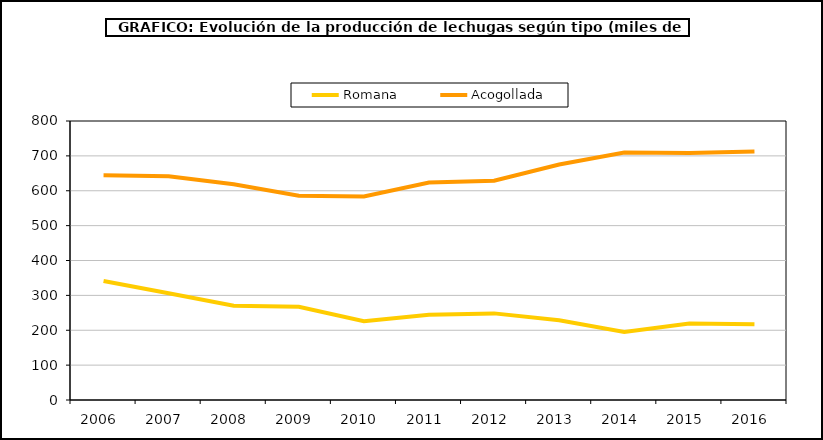
| Category | Romana | Acogollada |
|---|---|---|
| 2006.0 | 341.254 | 644.607 |
| 2007.0 | 306.019 | 641.593 |
| 2008.0 | 270.572 | 618.661 |
| 2009.0 | 267.562 | 585.426 |
| 2010.0 | 225.829 | 583.561 |
| 2011.0 | 244.577 | 623.859 |
| 2012.0 | 248.374 | 628.552 |
| 2013.0 | 228.928 | 675.355 |
| 2014.0 | 195.068 | 709.734 |
| 2015.0 | 219.245 | 708.133 |
| 2016.0 | 217.427 | 712.517 |